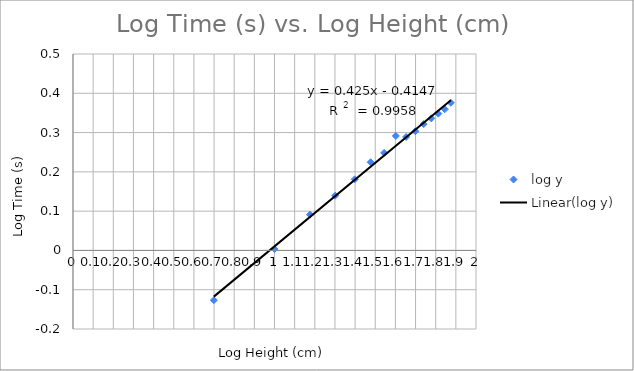
| Category | log y |
|---|---|
| 0.6989700043360189 | -0.127 |
| 1.0 | 0.003 |
| 1.1760912590556813 | 0.091 |
| 1.3010299956639813 | 0.139 |
| 1.3979400086720377 | 0.181 |
| 1.4771212547196624 | 0.224 |
| 1.5440680443502757 | 0.248 |
| 1.6020599913279623 | 0.291 |
| 1.6532125137753437 | 0.289 |
| 1.6989700043360187 | 0.303 |
| 1.7403626894942439 | 0.322 |
| 1.7781512503836436 | 0.336 |
| 1.8129133566428555 | 0.348 |
| 1.845098040014257 | 0.36 |
| 1.8750612633917 | 0.376 |